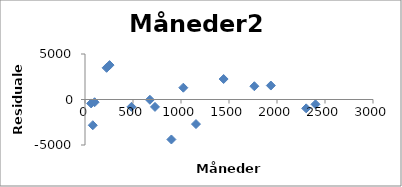
| Category | Series 0 |
|---|---|
| 64.0 | -431.114 |
| 81.0 | -2829.499 |
| 100.0 | -299.301 |
| 225.0 | 3480.423 |
| 256.0 | 3782.115 |
| 484.0 | -807.508 |
| 729.0 | -812.849 |
| 676.0 | -28.945 |
| 900.0 | -4393.066 |
| 1156.0 | -2699.871 |
| 1024.0 | 1296.367 |
| 1444.0 | 2250.641 |
| 1764.0 | 1458.469 |
| 1936.0 | 1533.876 |
| 2304.0 | -972.322 |
| 2401.0 | -527.416 |